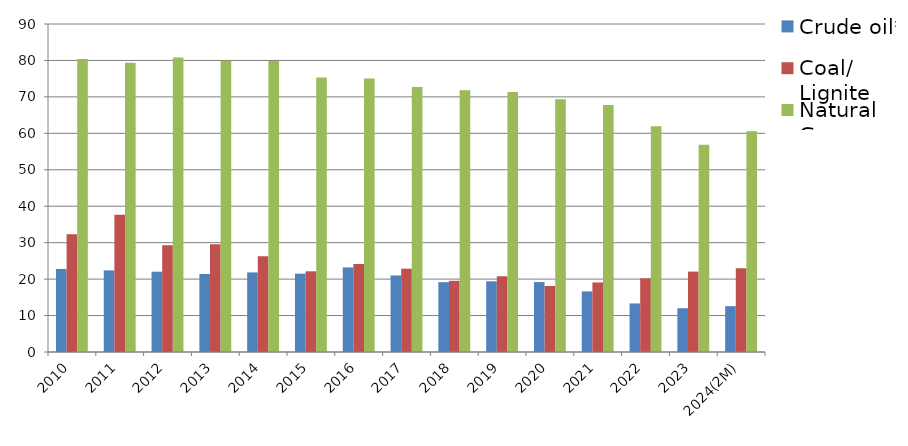
| Category | Crude oil* | Coal/ Lignite | Natural Gas |
|---|---|---|---|
| 2010 | 22.784 | 32.299 | 80.406 |
| 2011 | 22.397 | 37.631 | 79.379 |
| 2012 | 22.036 | 29.314 | 80.776 |
| 2013 | 21.401 | 29.593 | 79.95 |
| 2014 | 21.845 | 26.3 | 79.88 |
| 2015 | 21.495 | 22.141 | 75.29 |
| 2016 | 23.204 | 24.178 | 75.079 |
| 2017 | 21.001 | 22.863 | 72.696 |
| 2018 | 19.166 | 19.53 | 71.787 |
| 2019 | 19.398 | 20.781 | 71.329 |
| 2020 | 19.19 | 18.113 | 69.384 |
| 2021 | 16.633 | 19.082 | 67.78 |
| 2022 | 13.323 | 20.23 | 61.929 |
| 2023 | 12.007 | 22.06 | 56.866 |
| 2024(2M) | 12.573 | 22.979 | 60.543 |